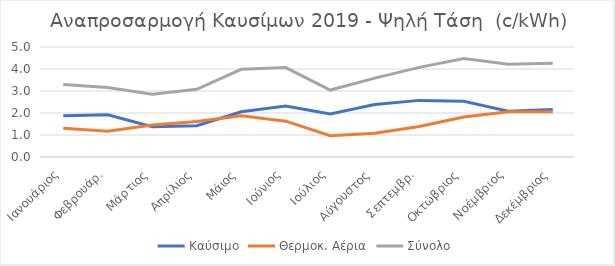
| Category | Καύσιμο | Θερμοκ. Αέρια | Σύνολο |
|---|---|---|---|
| Ιανουάριος | 1.878 | 1.303 | 3.301 |
| Φεβρουάρ. | 1.92 | 1.173 | 3.161 |
| Μάρτιος | 1.372 | 1.452 | 2.856 |
| Απρίλιος | 1.425 | 1.614 | 3.074 |
| Μάιος | 2.056 | 1.875 | 3.985 |
| Ιούνιος | 2.314 | 1.629 | 4.066 |
| Ιούλιος | 1.957 | 0.969 | 3.043 |
| Αύγουστος | 2.382 | 1.084 | 3.586 |
| Σεπτεμβρ. | 2.574 | 1.383 | 4.074 |
| Οκτώβριος | 2.529 | 1.817 | 4.478 |
| Νοέμβριος | 2.078 | 2.052 | 4.216 |
| Δεκέμβριος | 2.164 | 2.053 | 4.259 |